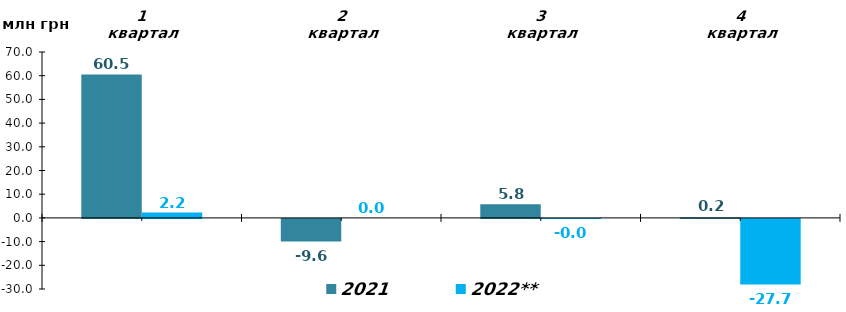
| Category | 2021 | 2022** |
|---|---|---|
| 1 квартал | 60.534 | 2.241 |
| 2 квартал | -9.557 | 0 |
| 3 квартал | 5.764 | -0.002 |
| 4 квартал | 0.175 | -27.716 |